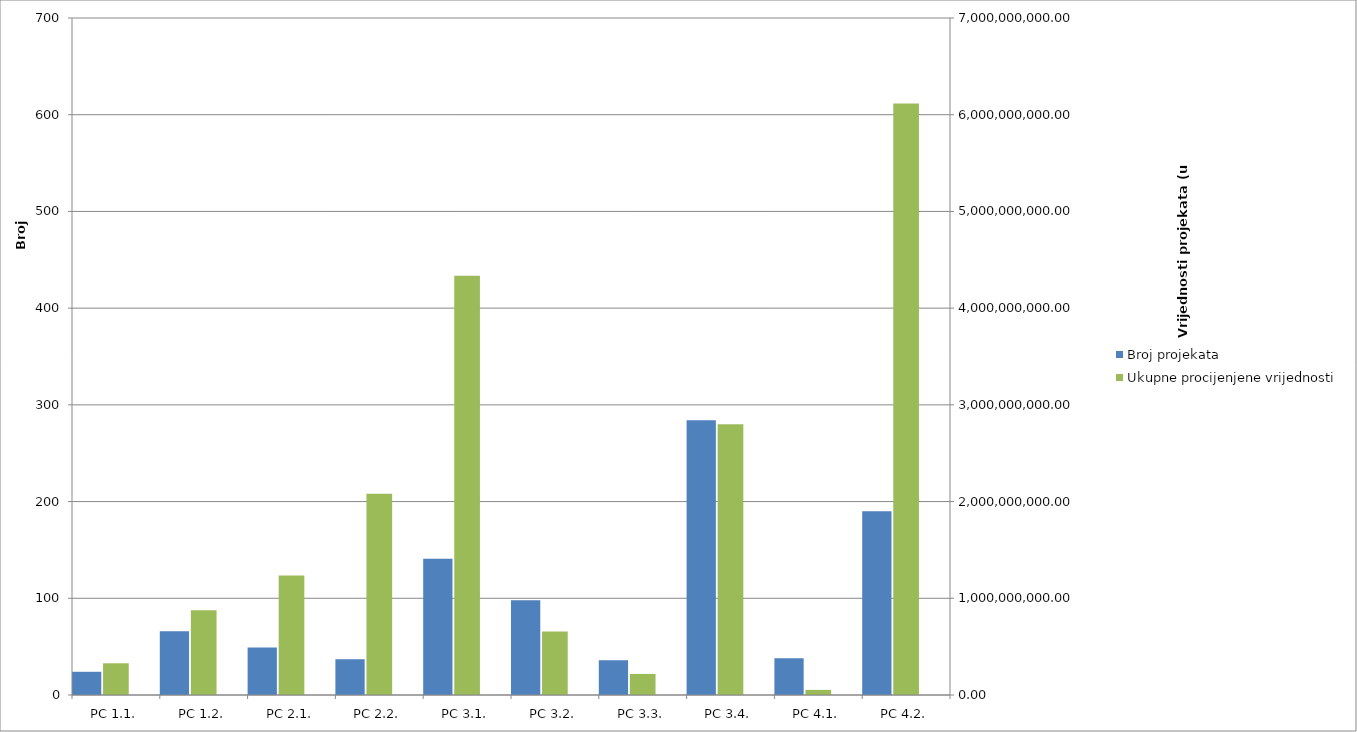
| Category | Broj projekata | Series 1 |
|---|---|---|
| PC 1.1. | 24 |  |
| PC 1.2. | 66 |  |
| PC 2.1. | 49 |  |
| PC 2.2. | 37 |  |
| PC 3.1. | 141 |  |
| PC 3.2. | 98 |  |
| PC 3.3. | 36 |  |
| PC 3.4. | 284 |  |
| PC 4.1. | 38 |  |
| PC 4.2. | 190 |  |